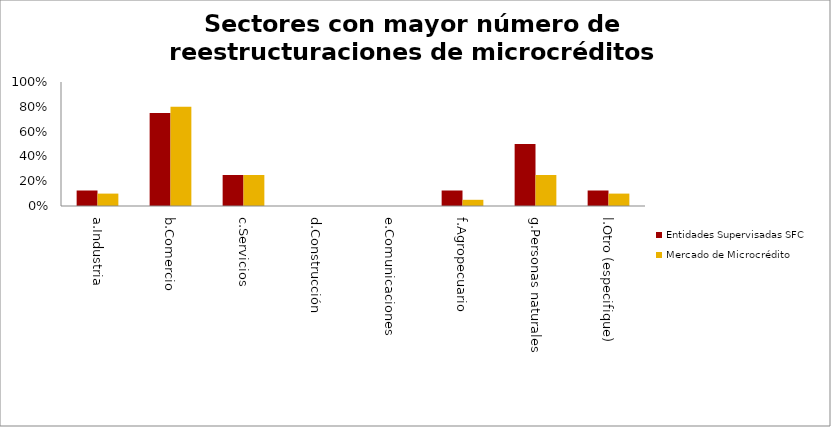
| Category | Entidades Supervisadas SFC | Mercado de Microcrédito |
|---|---|---|
| a.Industria | 0.125 | 0.1 |
| b.Comercio | 0.75 | 0.8 |
| c.Servicios | 0.25 | 0.25 |
| d.Construcción | 0 | 0 |
| e.Comunicaciones | 0 | 0 |
| f.Agropecuario | 0.125 | 0.05 |
| g.Personas naturales | 0.5 | 0.25 |
| l.Otro (especifique) | 0.125 | 0.1 |